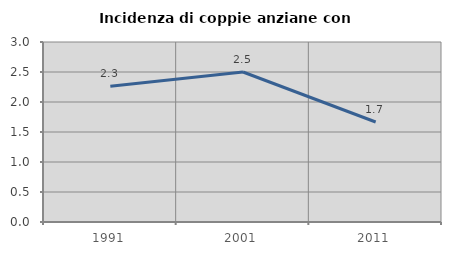
| Category | Incidenza di coppie anziane con figli |
|---|---|
| 1991.0 | 2.264 |
| 2001.0 | 2.5 |
| 2011.0 | 1.667 |